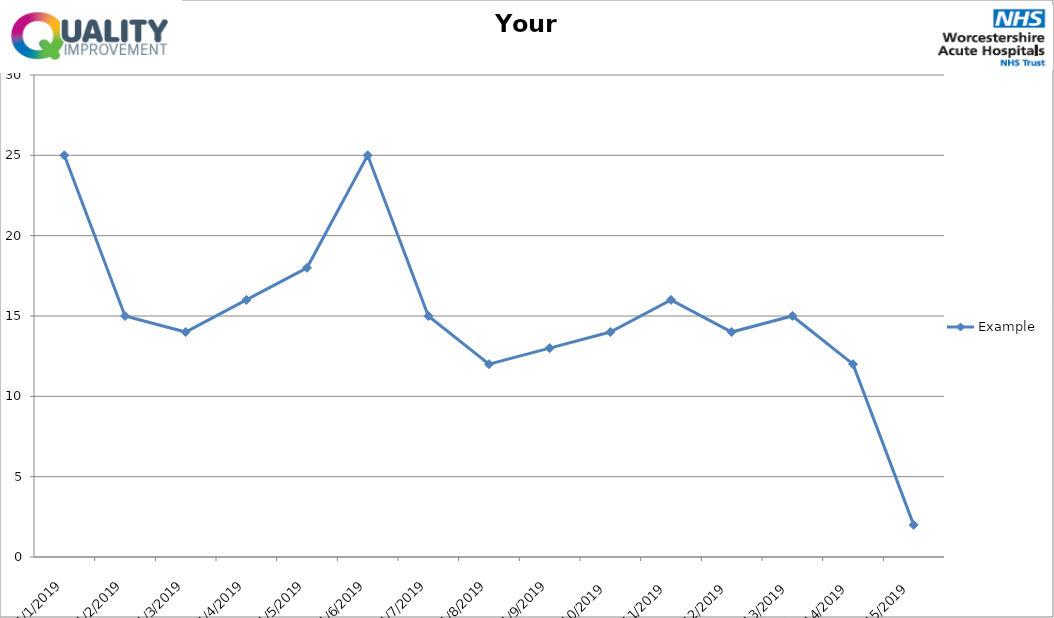
| Category | Example |
|---|---|
| 11/1/19 | 25 |
| 11/2/19 | 15 |
| 11/3/19 | 14 |
| 11/4/19 | 16 |
| 11/5/19 | 18 |
| 11/6/19 | 25 |
| 11/7/19 | 15 |
| 11/8/19 | 12 |
| 11/9/19 | 13 |
| 11/10/19 | 14 |
| 11/11/19 | 16 |
| 11/12/19 | 14 |
| 11/13/19 | 15 |
| 11/14/19 | 12 |
| 11/15/19 | 2 |